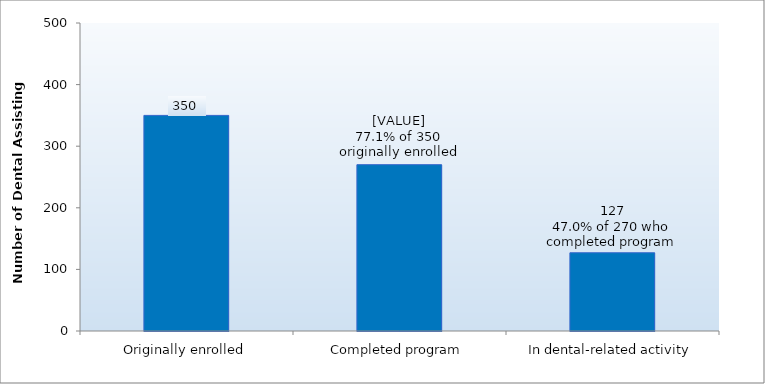
| Category | Series 0 |
|---|---|
| Originally enrolled | 350 |
| Completed program | 270 |
| In dental-related activity | 127 |